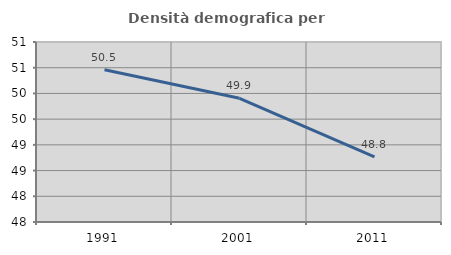
| Category | Densità demografica |
|---|---|
| 1991.0 | 50.462 |
| 2001.0 | 49.906 |
| 2011.0 | 48.764 |